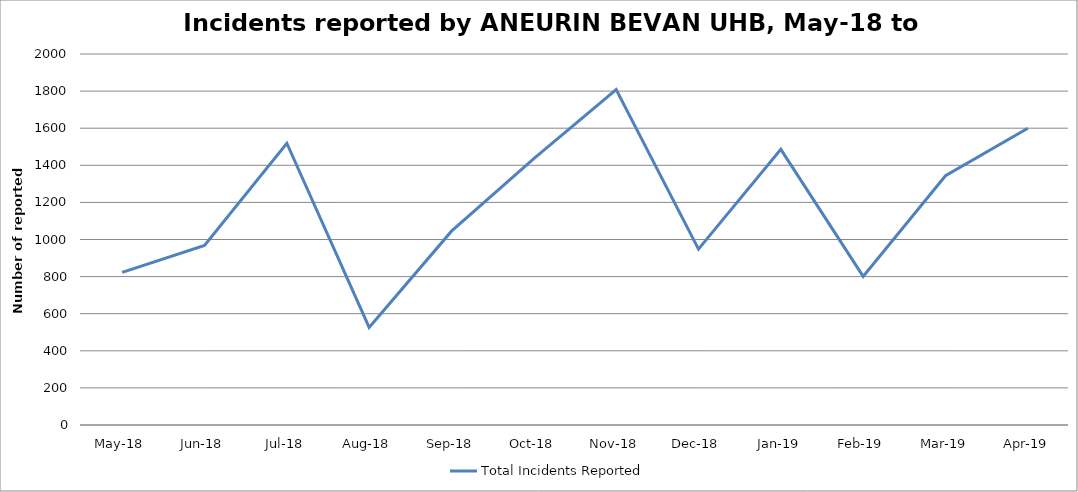
| Category | Total Incidents Reported |
|---|---|
| May-18 | 823 |
| Jun-18 | 968 |
| Jul-18 | 1519 |
| Aug-18 | 526 |
| Sep-18 | 1045 |
| Oct-18 | 1436 |
| Nov-18 | 1808 |
| Dec-18 | 948 |
| Jan-19 | 1486 |
| Feb-19 | 801 |
| Mar-19 | 1344 |
| Apr-19 | 1600 |